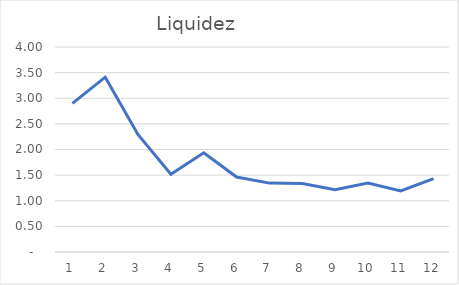
| Category | Series 0 |
|---|---|
| 0 | 2.9 |
| 1 | 3.412 |
| 2 | 2.288 |
| 3 | 1.516 |
| 4 | 1.937 |
| 5 | 1.462 |
| 6 | 1.344 |
| 7 | 1.334 |
| 8 | 1.214 |
| 9 | 1.344 |
| 10 | 1.193 |
| 11 | 1.431 |